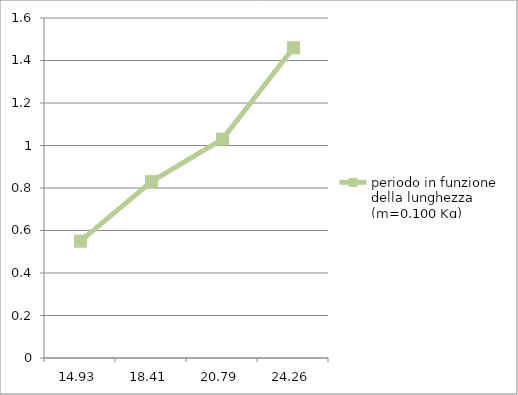
| Category | periodo in funzione della lunghezza (m=0,100 Kg) |
|---|---|
| 14.93 | 0.55 |
| 18.41 | 0.83 |
| 20.79 | 1.03 |
| 24.26 | 1.46 |